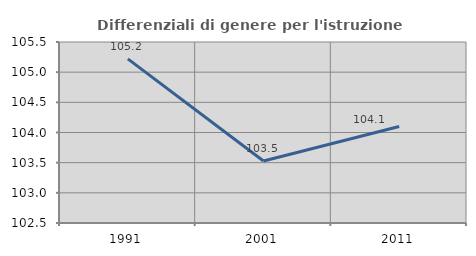
| Category | Differenziali di genere per l'istruzione superiore |
|---|---|
| 1991.0 | 105.22 |
| 2001.0 | 103.528 |
| 2011.0 | 104.098 |